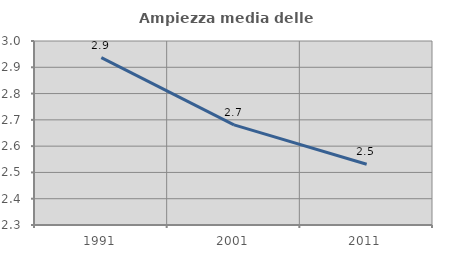
| Category | Ampiezza media delle famiglie |
|---|---|
| 1991.0 | 2.936 |
| 2001.0 | 2.681 |
| 2011.0 | 2.531 |